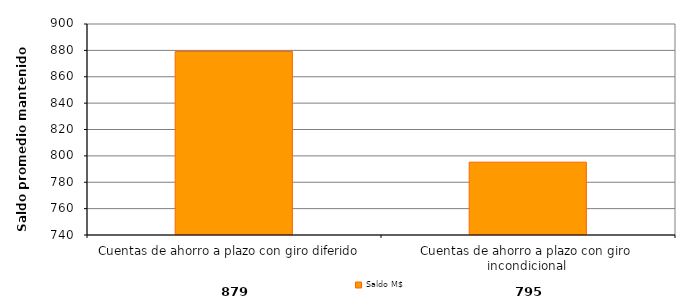
| Category | Saldo M$ |
|---|---|
| Cuentas de ahorro a plazo con giro diferido | 879.159 |
| Cuentas de ahorro a plazo con giro incondicional | 795.216 |